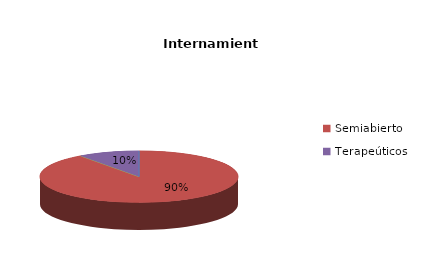
| Category | Series 0 |
|---|---|
| Cerrado | 0 |
| Semiabierto | 18 |
| Abierto | 0 |
| Terapeúticos | 2 |